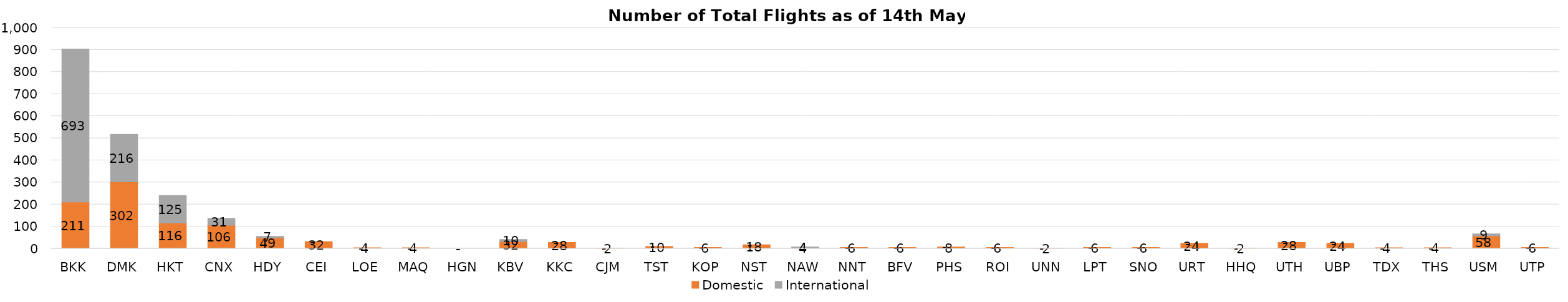
| Category | Domestic | International |
|---|---|---|
| BKK | 211 | 693 |
| DMK | 302 | 216 |
| HKT | 116 | 125 |
| CNX | 106 | 31 |
| HDY | 49 | 7 |
| CEI | 32 | 0 |
| LOE | 4 | 0 |
| MAQ | 4 | 0 |
| HGN | 0 | 0 |
| KBV | 32 | 10 |
| KKC | 28 | 0 |
| CJM | 2 | 0 |
| TST | 10 | 0 |
| KOP | 6 | 0 |
| NST | 18 | 0 |
| NAW | 4 | 4 |
| NNT | 6 | 0 |
| BFV | 6 | 0 |
| PHS | 8 | 0 |
| ROI | 6 | 0 |
| UNN | 2 | 0 |
| LPT | 6 | 0 |
| SNO | 6 | 0 |
| URT | 24 | 0 |
| HHQ | 2 | 0 |
| UTH | 28 | 0 |
| UBP | 24 | 0 |
| TDX | 4 | 0 |
| THS | 4 | 0 |
| USM | 58 | 9 |
| UTP | 6 | 0 |